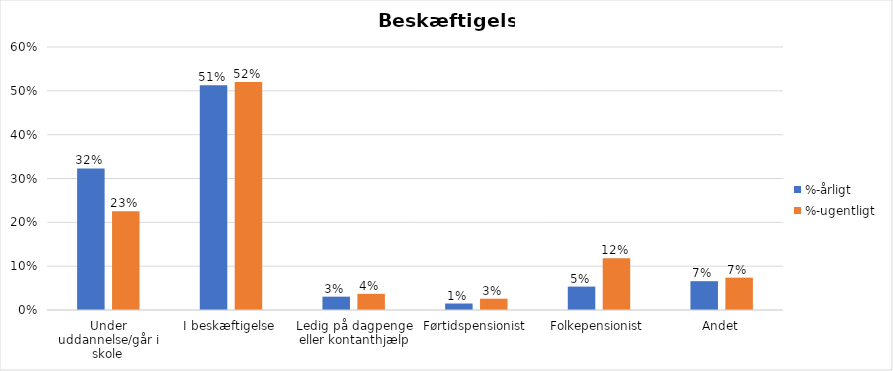
| Category | %-årligt | %-ugentligt |
|---|---|---|
| Under uddannelse/går i skole | 0.323 | 0.225 |
| I beskæftigelse | 0.513 | 0.52 |
| Ledig på dagpenge eller kontanthjælp | 0.03 | 0.037 |
| Førtidspensionist | 0.015 | 0.026 |
| Folkepensionist | 0.053 | 0.118 |
| Andet | 0.066 | 0.074 |